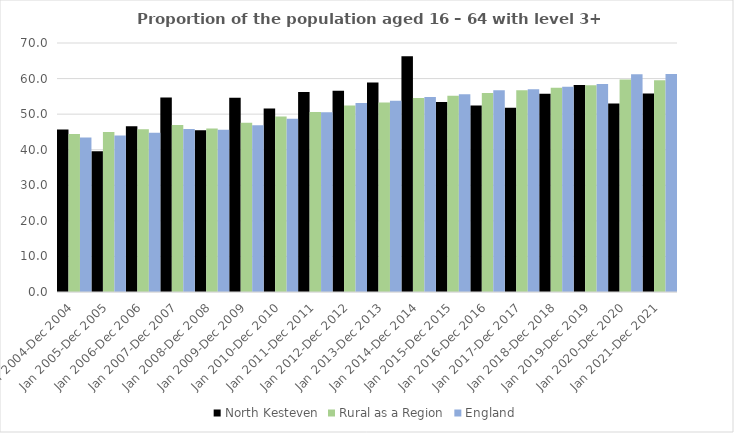
| Category | North Kesteven | Rural as a Region | England |
|---|---|---|---|
| Jan 2004-Dec 2004 | 45.7 | 44.405 | 43.4 |
| Jan 2005-Dec 2005 | 39.6 | 44.973 | 44 |
| Jan 2006-Dec 2006 | 46.6 | 45.774 | 44.8 |
| Jan 2007-Dec 2007 | 54.7 | 46.968 | 45.8 |
| Jan 2008-Dec 2008 | 45.5 | 45.964 | 45.6 |
| Jan 2009-Dec 2009 | 54.6 | 47.59 | 46.9 |
| Jan 2010-Dec 2010 | 51.6 | 49.362 | 48.7 |
| Jan 2011-Dec 2011 | 56.2 | 50.602 | 50.5 |
| Jan 2012-Dec 2012 | 56.6 | 52.439 | 53.1 |
| Jan 2013-Dec 2013 | 58.9 | 53.276 | 53.8 |
| Jan 2014-Dec 2014 | 66.3 | 54.57 | 54.8 |
| Jan 2015-Dec 2015 | 53.4 | 55.16 | 55.6 |
| Jan 2016-Dec 2016 | 52.4 | 55.941 | 56.7 |
| Jan 2017-Dec 2017 | 51.8 | 56.689 | 57 |
| Jan 2018-Dec 2018 | 55.7 | 57.389 | 57.7 |
| Jan 2019-Dec 2019 | 58.2 | 58.147 | 58.5 |
| Jan 2020-Dec 2020 | 53 | 59.771 | 61.2 |
| Jan 2021-Dec 2021 | 55.8 | 59.54 | 61.3 |